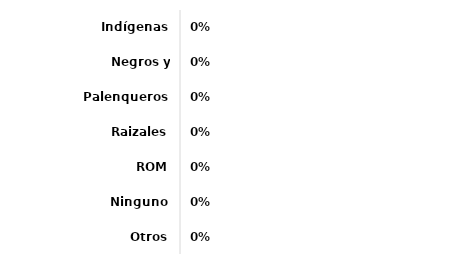
| Category | Series 0 |
|---|---|
| Indígenas | 0 |
| Negros y afrocolombianos | 0 |
| Palenqueros | 0 |
| Raizales | 0 |
| ROM | 0 |
| Ninguno | 0 |
| Otros | 0 |